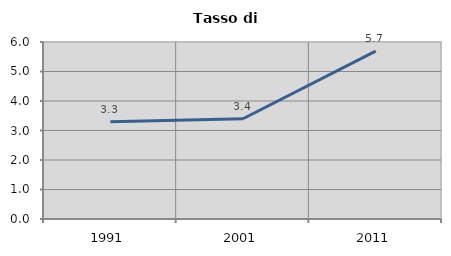
| Category | Tasso di disoccupazione   |
|---|---|
| 1991.0 | 3.299 |
| 2001.0 | 3.399 |
| 2011.0 | 5.693 |